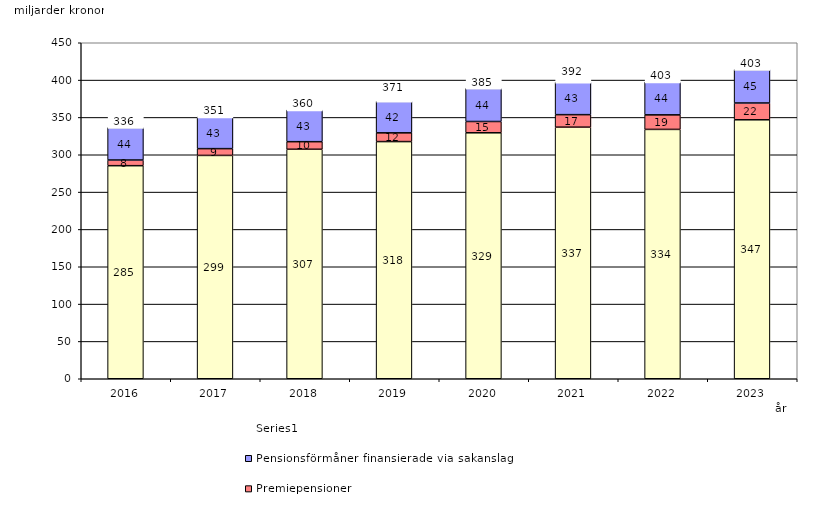
| Category | Inkomstpension och tilläggspension m.m. | Premiepensioner | Pensionsförmåner finansierade via sakanslag | Series 0 |
|---|---|---|---|---|
| 2016.0 | 285.357 | 7.598 | 43.541 | 20 |
| 2017.0 | 299.103 | 9.081 | 42.508 | 20 |
| 2018.0 | 307.356 | 10.141 | 42.538 | 20 |
| 2019.0 | 317.628 | 11.715 | 42.209 | 20 |
| 2020.0 | 329.414 | 15.138 | 44.356 | 20 |
| 2021.0 | 336.955 | 16.755 | 43.42 | 20 |
| 2022.0 | 333.95 | 19.489 | 44.09 | 20 |
| 2023.0 | 346.852 | 22.464 | 44.838 | 20 |